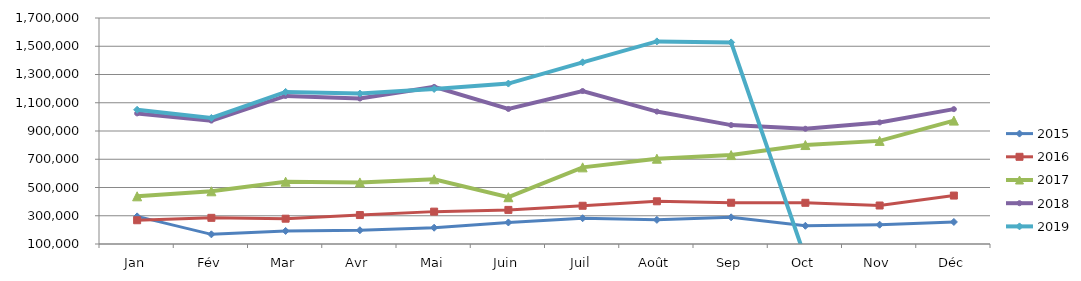
| Category | 2015 | 2016 | 2017 | 2018 | 2019 |
|---|---|---|---|---|---|
| Jan | 295561.257 | 268143.886 | 437608.679 | 1024591.283 | 1050220.805 |
| Fév | 168352.236 | 285225.823 | 473128.689 | 973642.608 | 992184.961 |
| Mar | 192553.569 | 279133.643 | 541018.539 | 1147958.731 | 1176757.88 |
| Avr | 197433.052 | 304918.016 | 535872.374 | 1129676.714 | 1164825.987 |
| Mai | 215249.669 | 329195.488 | 558232.45 | 1212070.878 | 1197851.486 |
| Juin | 252442.012 | 341474.145 | 431128.916 | 1056092.947 | 1235809.908 |
| Juil | 282492.061 | 370771.491 | 642508.579 | 1183060.966 | 1386180.582 |
| Août | 270853.736 | 402331.575 | 703832.356 | 1037606.311 | 1534426.4 |
| Sep | 288809.458 | 392045.647 | 729625.421 | 941820.554 | 1527323.009 |
| Oct | 228913.761 | 391645.177 | 800645.955 | 915772.772 | 0 |
| Nov | 236677.943 | 372499.386 | 830004.967 | 960817.552 | 0 |
| Déc | 256052.835 | 442895.412 | 973525.964 | 1054685.303 | 0 |